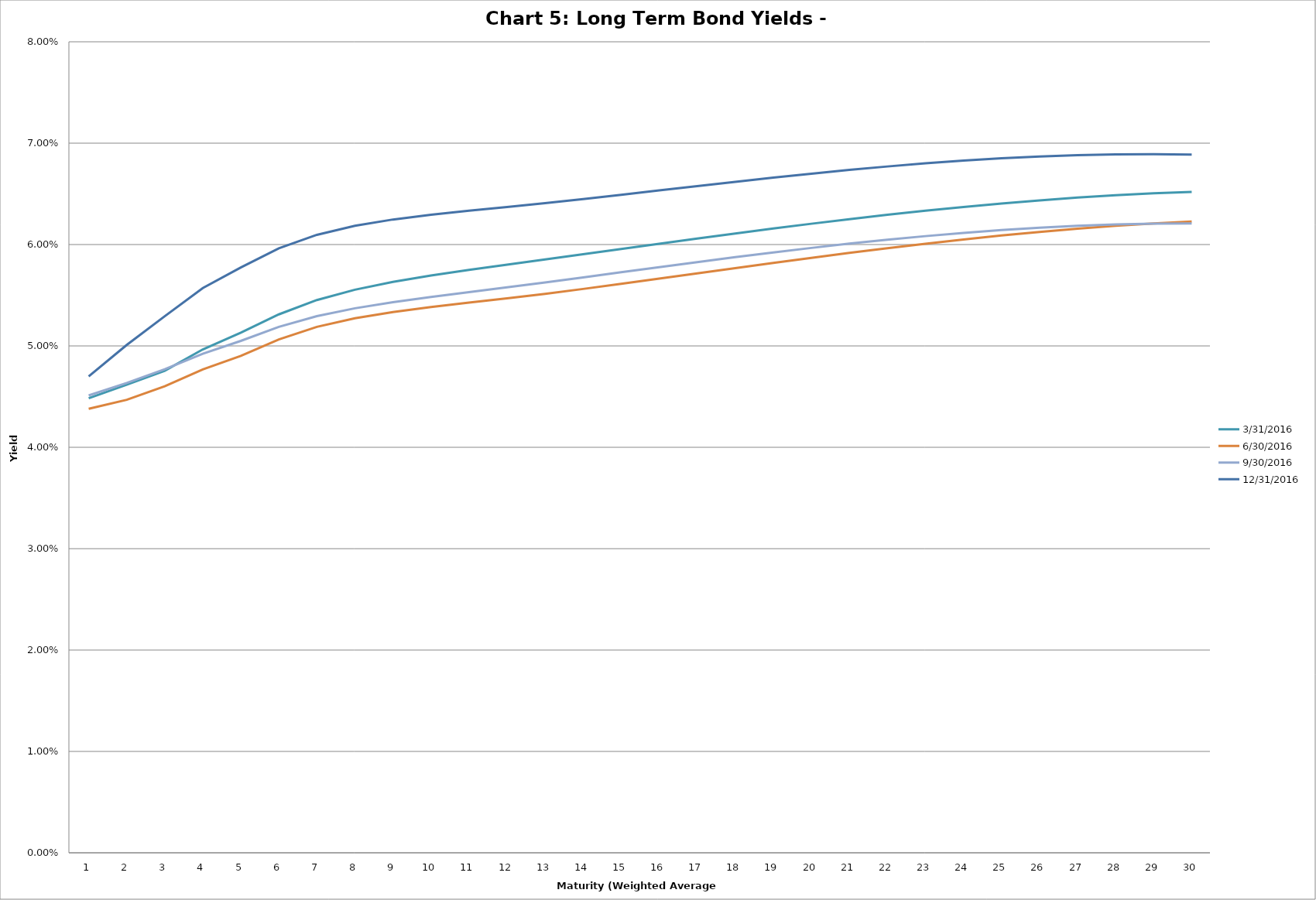
| Category | 3/31/2016 | 6/30/2016 | 9/30/2016 | 12/31/2016 |
|---|---|---|---|---|
| 0 | 0.045 | 0.044 | 0.045 | 0.047 |
| 1 | 0.046 | 0.045 | 0.046 | 0.05 |
| 2 | 0.048 | 0.046 | 0.048 | 0.053 |
| 3 | 0.05 | 0.048 | 0.049 | 0.056 |
| 4 | 0.051 | 0.049 | 0.05 | 0.058 |
| 5 | 0.053 | 0.051 | 0.052 | 0.06 |
| 6 | 0.055 | 0.052 | 0.053 | 0.061 |
| 7 | 0.056 | 0.053 | 0.054 | 0.062 |
| 8 | 0.056 | 0.053 | 0.054 | 0.062 |
| 9 | 0.057 | 0.054 | 0.055 | 0.063 |
| 10 | 0.057 | 0.054 | 0.055 | 0.063 |
| 11 | 0.058 | 0.055 | 0.056 | 0.064 |
| 12 | 0.059 | 0.055 | 0.056 | 0.064 |
| 13 | 0.059 | 0.056 | 0.057 | 0.064 |
| 14 | 0.06 | 0.056 | 0.057 | 0.065 |
| 15 | 0.06 | 0.057 | 0.058 | 0.065 |
| 16 | 0.061 | 0.057 | 0.058 | 0.066 |
| 17 | 0.061 | 0.058 | 0.059 | 0.066 |
| 18 | 0.062 | 0.058 | 0.059 | 0.067 |
| 19 | 0.062 | 0.059 | 0.06 | 0.067 |
| 20 | 0.063 | 0.059 | 0.06 | 0.067 |
| 21 | 0.063 | 0.06 | 0.06 | 0.068 |
| 22 | 0.063 | 0.06 | 0.061 | 0.068 |
| 23 | 0.064 | 0.061 | 0.061 | 0.068 |
| 24 | 0.064 | 0.061 | 0.061 | 0.069 |
| 25 | 0.064 | 0.061 | 0.062 | 0.069 |
| 26 | 0.065 | 0.062 | 0.062 | 0.069 |
| 27 | 0.065 | 0.062 | 0.062 | 0.069 |
| 28 | 0.065 | 0.062 | 0.062 | 0.069 |
| 29 | 0.065 | 0.062 | 0.062 | 0.069 |